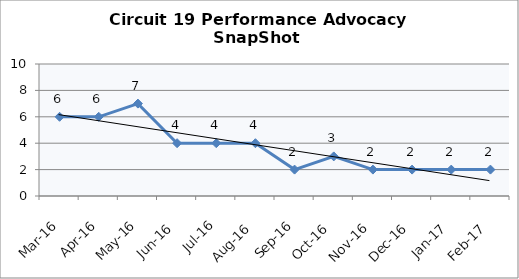
| Category | Circuit 19 |
|---|---|
| Mar-16 | 6 |
| Apr-16 | 6 |
| May-16 | 7 |
| Jun-16 | 4 |
| Jul-16 | 4 |
| Aug-16 | 4 |
| Sep-16 | 2 |
| Oct-16 | 3 |
| Nov-16 | 2 |
| Dec-16 | 2 |
| Jan-17 | 2 |
| Feb-17 | 2 |